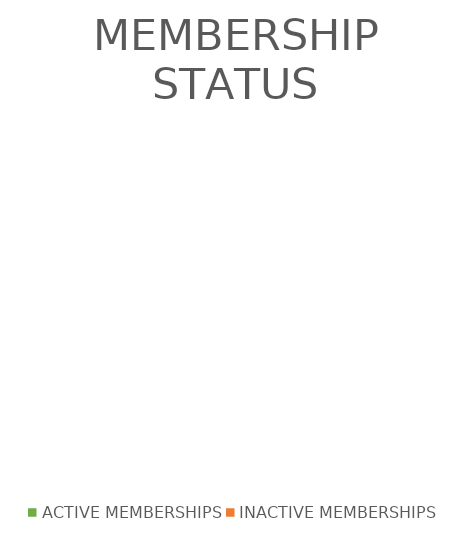
| Category | MEMBERSHIP STATUS |
|---|---|
| ACTIVE MEMBERSHIPS | 0 |
| INACTIVE MEMBERSHIPS | 0 |